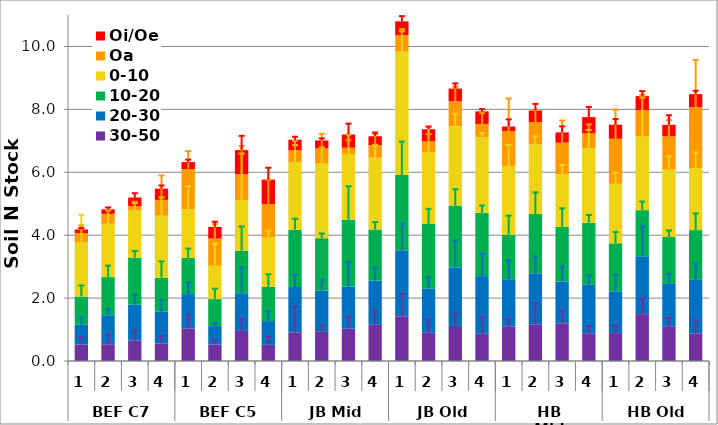
| Category | 30-50 | 20-30 | 10-20 | 0-10 | Oa | Oi/Oe |
|---|---|---|---|---|---|---|
| 0 | 0.522 | 0.631 | 0.895 | 1.735 | 0.286 | 0.114 |
| 1 | 0.532 | 0.924 | 1.211 | 1.699 | 0.311 | 0.145 |
| 2 | 0.647 | 1.142 | 1.499 | 1.498 | 0.142 | 0.27 |
| 3 | 0.559 | 1.009 | 1.079 | 1.976 | 0.5 | 0.357 |
| 4 | 1.036 | 1.09 | 1.15 | 1.551 | 1.273 | 0.224 |
| 5 | 0.527 | 0.583 | 0.858 | 1.057 | 0.867 | 0.371 |
| 6 | 0.957 | 1.198 | 1.35 | 1.616 | 0.821 | 0.763 |
| 7 | 0.514 | 0.755 | 1.085 | 1.567 | 1.063 | 0.783 |
| 8 | 0.903 | 1.449 | 1.824 | 2.136 | 0.391 | 0.331 |
| 9 | 0.928 | 1.309 | 1.668 | 2.372 | 0.479 | 0.256 |
| 10 | 1.027 | 1.341 | 2.124 | 2.086 | 0.203 | 0.419 |
| 11 | 1.15 | 1.409 | 1.624 | 2.284 | 0.393 | 0.284 |
| 12 | 1.421 | 2.084 | 2.407 | 3.924 | 0.522 | 0.439 |
| 13 | 0.897 | 1.408 | 2.054 | 2.286 | 0.342 | 0.382 |
| 14 | 1.082 | 1.894 | 1.967 | 2.524 | 0.789 | 0.405 |
| 15 | 0.865 | 1.834 | 2.012 | 2.399 | 0.428 | 0.399 |
| 16 | 1.091 | 1.51 | 1.415 | 2.187 | 1.107 | 0.142 |
| 17 | 1.17 | 1.619 | 1.885 | 2.214 | 0.71 | 0.365 |
| 18 | 1.189 | 1.338 | 1.74 | 1.672 | 1.004 | 0.325 |
| 19 | 0.883 | 1.54 | 1.97 | 2.365 | 0.48 | 0.516 |
| 20 | 0.887 | 1.326 | 1.528 | 1.894 | 1.429 | 0.449 |
| 21 | 1.489 | 1.84 | 1.467 | 2.354 | 0.831 | 0.439 |
| 22 | 1.088 | 1.363 | 1.49 | 2.144 | 1.058 | 0.363 |
| 23 | 0.875 | 1.704 | 1.584 | 1.972 | 1.938 | 0.411 |